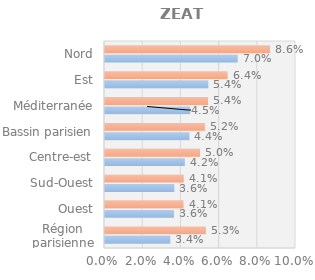
| Category | Series 0 | Series 1 |
|---|---|---|
| Région parisienne | 0.034 | 0.053 |
| Ouest | 0.036 | 0.041 |
| Sud-Ouest | 0.036 | 0.041 |
| Centre-est | 0.042 | 0.05 |
| Bassin parisien | 0.044 | 0.052 |
| Méditerranée | 0.045 | 0.054 |
| Est | 0.054 | 0.064 |
| Nord | 0.07 | 0.086 |